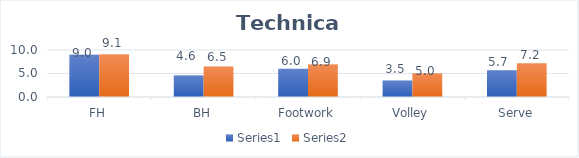
| Category | Series 0 | Series 1 |
|---|---|---|
| FH | 9 | 9.1 |
| BH | 4.6 | 6.5 |
| Footwork | 6 | 6.9 |
| Volley | 3.5 | 5 |
| Serve | 5.7 | 7.2 |